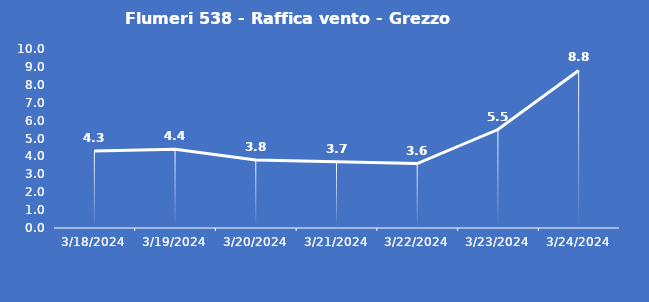
| Category | Flumeri 538 - Raffica vento - Grezzo (m/s) |
|---|---|
| 3/18/24 | 4.3 |
| 3/19/24 | 4.4 |
| 3/20/24 | 3.8 |
| 3/21/24 | 3.7 |
| 3/22/24 | 3.6 |
| 3/23/24 | 5.5 |
| 3/24/24 | 8.8 |